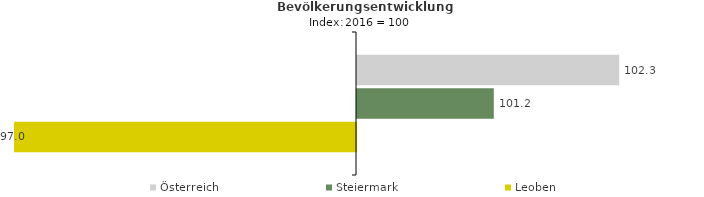
| Category | Österreich | Steiermark | Leoben |
|---|---|---|---|
| 2020.0 | 102.3 | 101.2 | 97 |